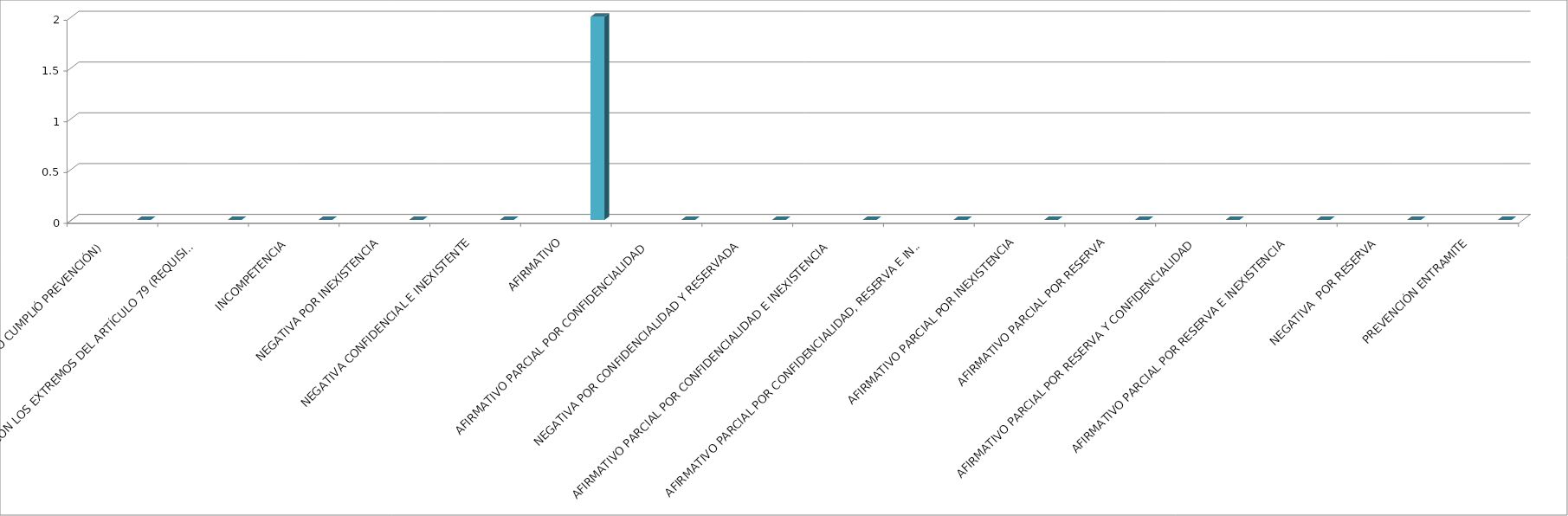
| Category | Series 0 | Series 1 | Series 2 | Series 3 | Series 4 |
|---|---|---|---|---|---|
| SE TIENE POR NO PRESENTADA ( NO CUMPLIÓ PREVENCIÓN) |  |  |  |  | 0 |
| NO CUMPLIO CON LOS EXTREMOS DEL ARTÍCULO 79 (REQUISITOS) |  |  |  |  | 0 |
| INCOMPETENCIA  |  |  |  |  | 0 |
| NEGATIVA POR INEXISTENCIA |  |  |  |  | 0 |
| NEGATIVA CONFIDENCIAL E INEXISTENTE |  |  |  |  | 0 |
| AFIRMATIVO |  |  |  |  | 2 |
| AFIRMATIVO PARCIAL POR CONFIDENCIALIDAD  |  |  |  |  | 0 |
| NEGATIVA POR CONFIDENCIALIDAD Y RESERVADA |  |  |  |  | 0 |
| AFIRMATIVO PARCIAL POR CONFIDENCIALIDAD E INEXISTENCIA |  |  |  |  | 0 |
| AFIRMATIVO PARCIAL POR CONFIDENCIALIDAD, RESERVA E INEXISTENCIA |  |  |  |  | 0 |
| AFIRMATIVO PARCIAL POR INEXISTENCIA |  |  |  |  | 0 |
| AFIRMATIVO PARCIAL POR RESERVA |  |  |  |  | 0 |
| AFIRMATIVO PARCIAL POR RESERVA Y CONFIDENCIALIDAD |  |  |  |  | 0 |
| AFIRMATIVO PARCIAL POR RESERVA E INEXISTENCIA |  |  |  |  | 0 |
| NEGATIVA  POR RESERVA |  |  |  |  | 0 |
| PREVENCIÓN ENTRAMITE |  |  |  |  | 0 |